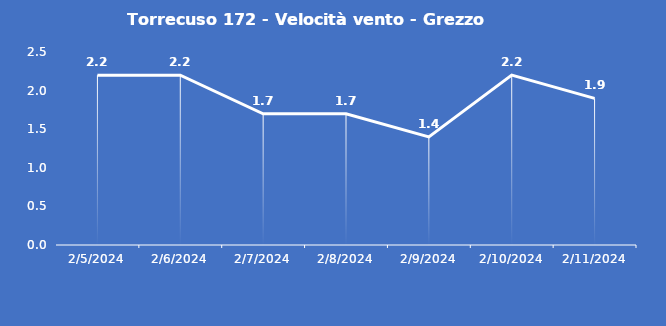
| Category | Torrecuso 172 - Velocità vento - Grezzo (m/s) |
|---|---|
| 2/5/24 | 2.2 |
| 2/6/24 | 2.2 |
| 2/7/24 | 1.7 |
| 2/8/24 | 1.7 |
| 2/9/24 | 1.4 |
| 2/10/24 | 2.2 |
| 2/11/24 | 1.9 |